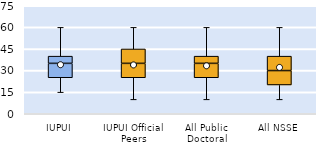
| Category | 25th | 50th | 75th |
|---|---|---|---|
| IUPUI | 25 | 10 | 5 |
| IUPUI Official Peers | 25 | 10 | 10 |
| All Public Doctoral | 25 | 10 | 5 |
| All NSSE | 20 | 10 | 10 |